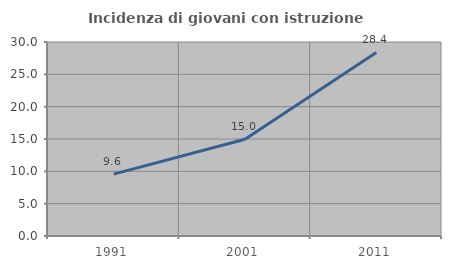
| Category | Incidenza di giovani con istruzione universitaria |
|---|---|
| 1991.0 | 9.574 |
| 2001.0 | 14.953 |
| 2011.0 | 28.395 |